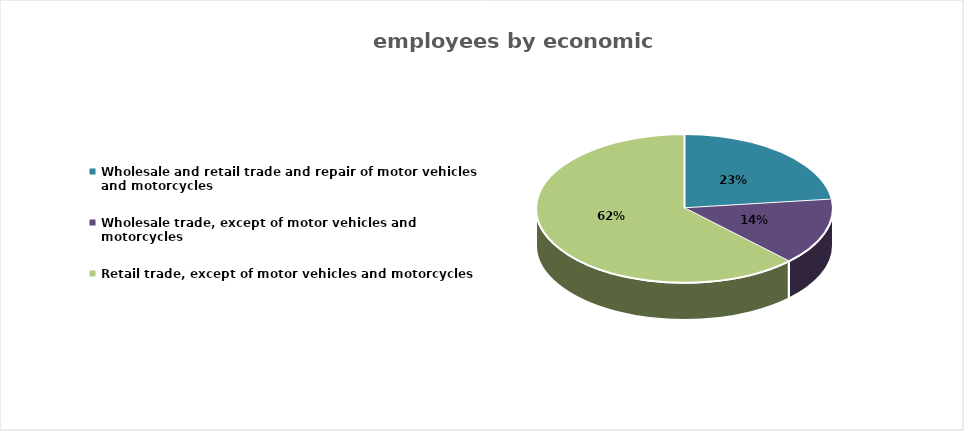
| Category | Series 0 | Series 1 |
|---|---|---|
| Wholesale and retail trade and repair of motor vehicles and motorcycles | 380182 | 735 |
| Wholesale trade, except of motor vehicles and motorcycles | 238251 | 2825 |
| Retail trade, except of motor vehicles and motorcycles | 1025631 | 13557 |